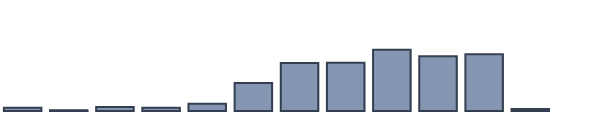
| Category | Series 0 |
|---|---|
| 0 | 1 |
| 1 | 0.2 |
| 2 | 1.3 |
| 3 | 1 |
| 4 | 2.3 |
| 5 | 8.8 |
| 6 | 15.1 |
| 7 | 15.2 |
| 8 | 19.3 |
| 9 | 17.3 |
| 10 | 17.9 |
| 11 | 0.6 |
| 12 | 0 |